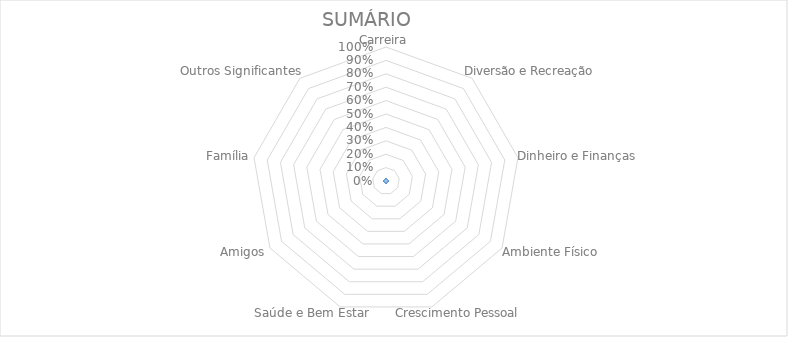
| Category | Series 0 |
|---|---|
| Carreira | 0 |
| Diversão e Recreação | 0 |
| Dinheiro e Finanças | 0 |
| Ambiente Físico | 0 |
| Crescimento Pessoal | 0 |
| Saúde e Bem Estar | 0 |
| Amigos | 0 |
| Família | 0 |
| Outros Significantes | 0 |